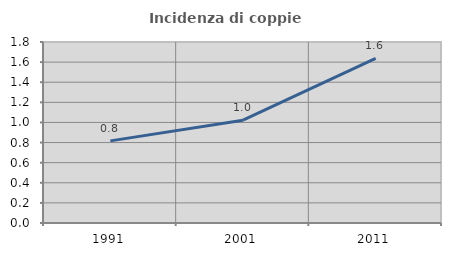
| Category | Incidenza di coppie miste |
|---|---|
| 1991.0 | 0.817 |
| 2001.0 | 1.022 |
| 2011.0 | 1.636 |